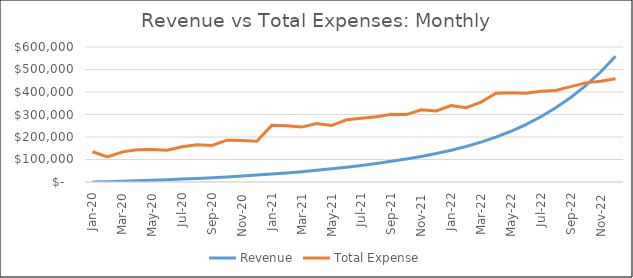
| Category | Revenue | Total Expense |
|---|---|---|
| 2020-01-01 | 225 | 134457.5 |
| 2020-02-29 | 1344.911 | 111387.5 |
| 2020-03-31 | 3001.99 | 133887.375 |
| 2020-04-30 | 5184.088 | 143283.675 |
| 2020-05-31 | 7541.829 | 144699.605 |
| 2020-06-30 | 10093.74 | 140986.628 |
| 2020-07-31 | 12860.179 | 156792.353 |
| 2020-08-31 | 15863.519 | 165244.026 |
| 2020-09-30 | 19128.349 | 162626.054 |
| 2020-10-31 | 22681.696 | 185760.659 |
| 2020-11-30 | 26553.271 | 184222.913 |
| 2020-12-31 | 30775.736 | 180731.391 |
| 2021-01-31 | 35385.001 | 252165.943 |
| 2021-02-28 | 40420.546 | 249821.827 |
| 2021-03-31 | 45925.785 | 244047.369 |
| 2021-04-30 | 51948.451 | 259791.832 |
| 2021-05-31 | 58541.037 | 250729.393 |
| 2021-06-30 | 65761.265 | 276555.819 |
| 2021-07-31 | 73672.617 | 283046.4 |
| 2021-08-31 | 82344.901 | 290457.251 |
| 2021-09-30 | 91854.896 | 300696.842 |
| 2021-10-31 | 102287.04 | 299505.136 |
| 2021-11-30 | 113734.2 | 321254.635 |
| 2021-12-31 | 126298.516 | 315850.459 |
| 2022-01-31 | 140849.17 | 339915.28 |
| 2022-02-28 | 157681.812 | 329997.932 |
| 2022-03-31 | 177136.495 | 355434.243 |
| 2022-04-30 | 199604.325 | 394897.967 |
| 2022-05-31 | 225535.127 | 397018.716 |
| 2022-06-30 | 255446.249 | 394396.776 |
| 2022-07-31 | 289932.686 | 403179.491 |
| 2022-08-31 | 329678.731 | 406783.572 |
| 2022-09-30 | 375471.365 | 423972.751 |
| 2022-10-31 | 428215.662 | 440561.613 |
| 2022-11-30 | 488952.498 | 447547.596 |
| 2022-12-31 | 558878.925 | 458689.633 |